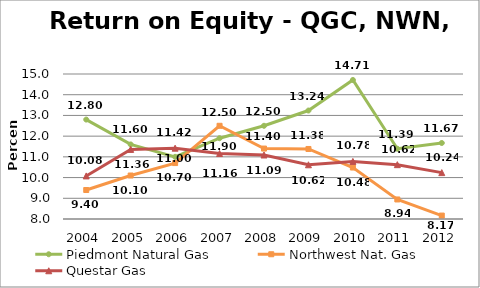
| Category | Piedmont Natural Gas | Northwest Nat. Gas | Questar Gas |
|---|---|---|---|
| 2004.0 | 12.8 | 9.4 | 10.08 |
| 2005.0 | 11.6 | 10.1 | 11.36 |
| 2006.0 | 11 | 10.7 | 11.42 |
| 2007.0 | 11.9 | 12.5 | 11.16 |
| 2008.0 | 12.5 | 11.4 | 11.09 |
| 2009.0 | 13.236 | 11.38 | 10.618 |
| 2010.0 | 14.711 | 10.484 | 10.78 |
| 2011.0 | 11.392 | 8.943 | 10.623 |
| 2012.0 | 11.67 | 8.165 | 10.239 |